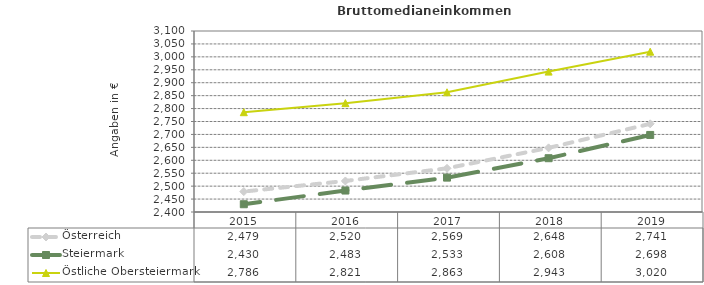
| Category | Österreich | Steiermark | Östliche Obersteiermark |
|---|---|---|---|
| 2019.0 | 2741 | 2698 | 3020 |
| 2018.0 | 2648 | 2608 | 2943 |
| 2017.0 | 2569 | 2533 | 2863 |
| 2016.0 | 2520 | 2483 | 2821 |
| 2015.0 | 2479 | 2430 | 2786 |